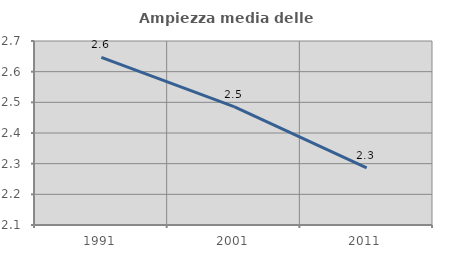
| Category | Ampiezza media delle famiglie |
|---|---|
| 1991.0 | 2.646 |
| 2001.0 | 2.486 |
| 2011.0 | 2.286 |